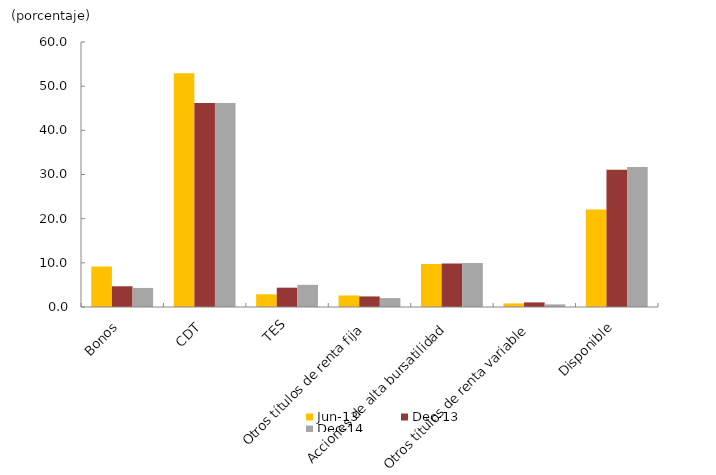
| Category | jun-13 | dic-13 | dic-14 |
|---|---|---|---|
| Bonos | 9.168 | 4.692 | 4.315 |
| CDT | 52.947 | 46.213 | 46.208 |
| TES | 2.876 | 4.377 | 5.018 |
| Otros títulos de renta fija | 2.612 | 2.388 | 2.02 |
| Acciones de alta bursatilidad | 9.714 | 9.866 | 9.938 |
| Otros títulos de renta variable | 0.81 | 1.043 | 0.585 |
| Disponible | 22.076 | 31.074 | 31.672 |